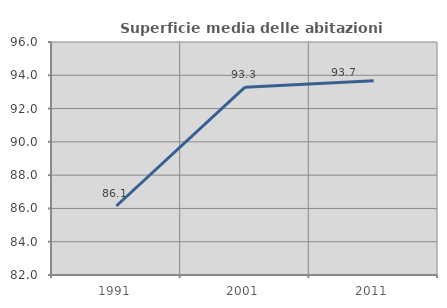
| Category | Superficie media delle abitazioni occupate |
|---|---|
| 1991.0 | 86.146 |
| 2001.0 | 93.288 |
| 2011.0 | 93.678 |